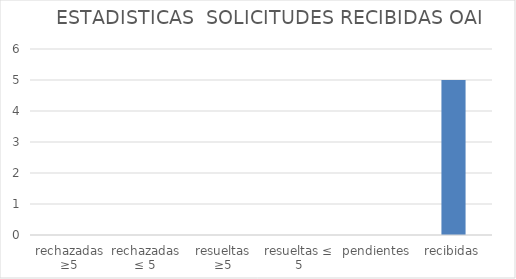
| Category | Series 0 |
|---|---|
| rechazadas ≥5 | 0 |
| rechazadas ≤ 5 | 0 |
| resueltas ≥5 | 0 |
| resueltas ≤ 5 | 0 |
| pendientes | 0 |
| recibidas | 5 |